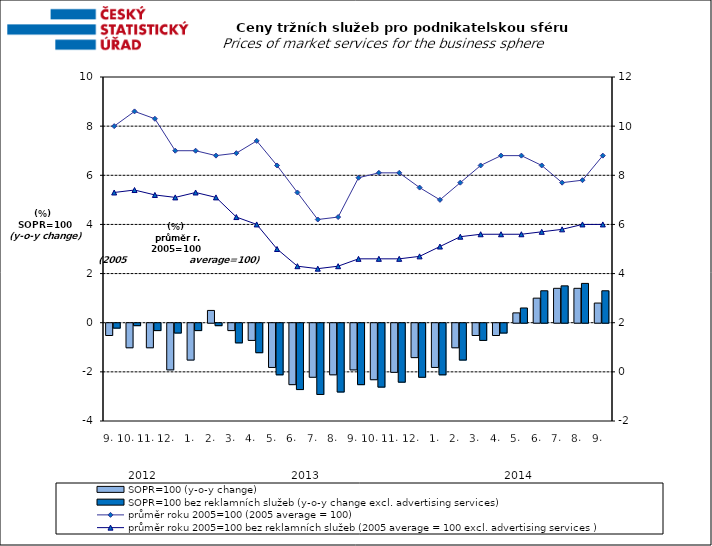
| Category | SOPR=100 (y-o-y change)   | SOPR=100 bez reklamních služeb (y-o-y change excl. advertising services)   |
|---|---|---|
| 0 | -0.5 | -0.2 |
| 1 | -1 | -0.1 |
| 2 | -1 | -0.3 |
| 3 | -1.9 | -0.4 |
| 4 | -1.5 | -0.3 |
| 5 | 0.5 | -0.1 |
| 6 | -0.3 | -0.8 |
| 7 | -0.7 | -1.2 |
| 8 | -1.8 | -2.1 |
| 9 | -2.5 | -2.7 |
| 10 | -2.2 | -2.9 |
| 11 | -2.1 | -2.8 |
| 12 | -1.9 | -2.5 |
| 13 | -2.3 | -2.6 |
| 14 | -2 | -2.4 |
| 15 | -1.4 | -2.2 |
| 16 | -1.8 | -2.1 |
| 17 | -1 | -1.5 |
| 18 | -0.5 | -0.7 |
| 19 | -0.5 | -0.4 |
| 20 | 0.4 | 0.6 |
| 21 | 1 | 1.3 |
| 22 | 1.4 | 1.5 |
| 23 | 1.4 | 1.6 |
| 24 | 0.8 | 1.3 |